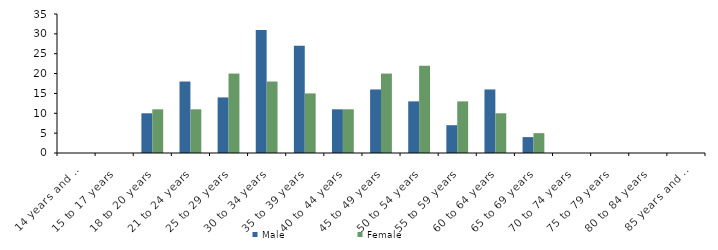
| Category | Male | Female |
|---|---|---|
| 14 years and under | 0 | 0 |
| 15 to 17 years | 0 | 0 |
| 18 to 20 years | 10 | 11 |
| 21 to 24 years | 18 | 11 |
| 25 to 29 years | 14 | 20 |
| 30 to 34 years | 31 | 18 |
| 35 to 39 years | 27 | 15 |
| 40 to 44 years | 11 | 11 |
| 45 to 49 years | 16 | 20 |
| 50 to 54 years | 13 | 22 |
| 55 to 59 years | 7 | 13 |
| 60 to 64 years | 16 | 10 |
| 65 to 69 years | 4 | 5 |
| 70 to 74 years | 0 | 0 |
| 75 to 79 years | 0 | 0 |
| 80 to 84 years | 0 | 0 |
| 85 years and over | 0 | 0 |